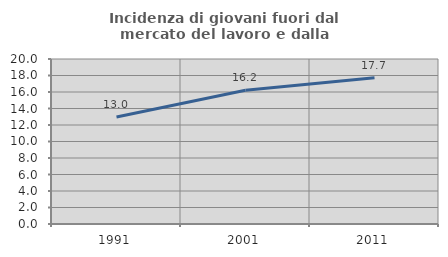
| Category | Incidenza di giovani fuori dal mercato del lavoro e dalla formazione  |
|---|---|
| 1991.0 | 12.964 |
| 2001.0 | 16.221 |
| 2011.0 | 17.729 |